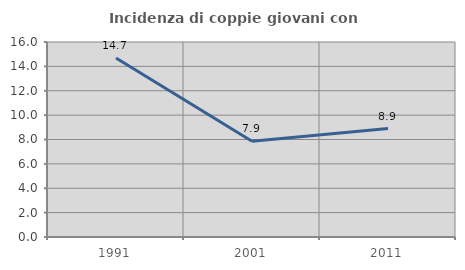
| Category | Incidenza di coppie giovani con figli |
|---|---|
| 1991.0 | 14.692 |
| 2001.0 | 7.86 |
| 2011.0 | 8.9 |